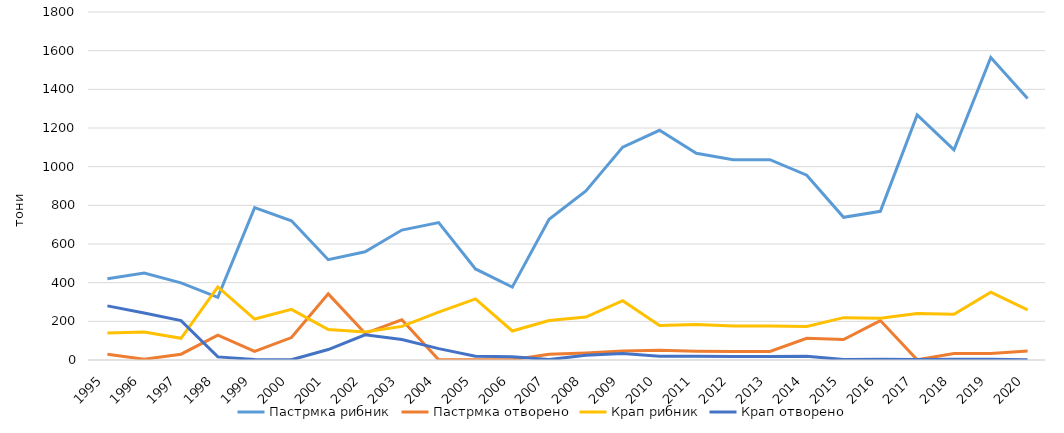
| Category | Пастрмка | Крап |
|---|---|---|
| 1995.0 | 30 | 280 |
| 1996.0 | 4 | 243 |
| 1997.0 | 30 | 204 |
| 1998.0 | 129 | 16 |
| 1999.0 | 44 | 3 |
| 2000.0 | 116 | 1 |
| 2001.0 | 342 | 54 |
| 2002.0 | 138 | 130 |
| 2003.0 | 208 | 106 |
| 2004.0 | 1 | 59 |
| 2005.0 | 1 | 19 |
| 2006.0 | 1 | 17 |
| 2007.0 | 30 | 2 |
| 2008.0 | 36 | 25 |
| 2009.0 | 46 | 33 |
| 2010.0 | 50 | 19 |
| 2011.0 | 45 | 19 |
| 2012.0 | 44 | 18 |
| 2013.0 | 44 | 18 |
| 2014.0 | 112 | 20 |
| 2015.0 | 106 | 2 |
| 2016.0 | 204 | 4 |
| 2017.0 | 1 | 2 |
| 2018.0 | 34 | 4 |
| 2019.0 | 34 | 4 |
| 2020.0 | 46 | 1 |